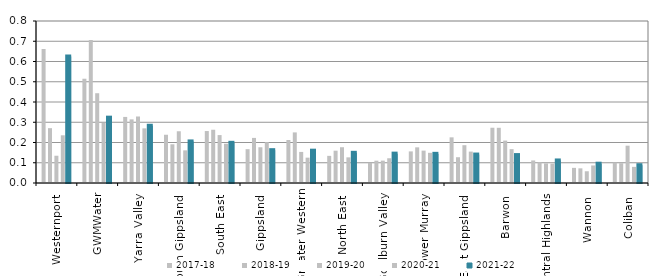
| Category | 2017-18 | 2018-19 | 2019-20 | 2020-21 | 2021-22 |
|---|---|---|---|---|---|
| Westernport  | 0.661 | 0.271 | 0.135 | 0.236 | 0.625 |
| GWMWater | 0.515 | 0.706 | 0.443 | 0.297 | 0.323 |
| Yarra Valley  | 0.326 | 0.314 | 0.328 | 0.27 | 0.283 |
| South Gippsland  | 0.238 | 0.191 | 0.255 | 0.161 | 0.205 |
| South East  | 0.257 | 0.263 | 0.237 | 0.194 | 0.198 |
| Gippsland  | 0.167 | 0.223 | 0.176 | 0.202 | 0.162 |
| Greater Western | 0.212 | 0.25 | 0.153 | 0.125 | 0.16 |
| North East  | 0.134 | 0.16 | 0.177 | 0.127 | 0.149 |
| Goulburn Valley  | 0.099 | 0.11 | 0.11 | 0.122 | 0.145 |
| Lower Murray  | 0.156 | 0.176 | 0.16 | 0.149 | 0.144 |
| East Gippsland  | 0.225 | 0.127 | 0.187 | 0.155 | 0.141 |
| Barwon  | 0.273 | 0.273 | 0.209 | 0.167 | 0.138 |
| Central Highlands  | 0.111 | 0.102 | 0.097 | 0.096 | 0.111 |
| Wannon  | 0.075 | 0.072 | 0.058 | 0.087 | 0.095 |
| Coliban  | 0.101 | 0.098 | 0.184 | 0.08 | 0.088 |